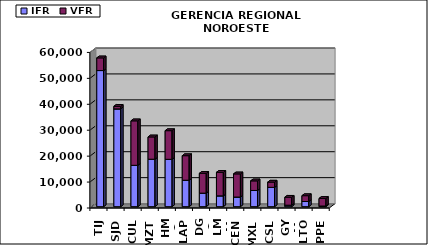
| Category | IFR | VFR |
|---|---|---|
| TIJ | 52501 | 4881 |
| SJD | 37712 | 986 |
| CUL | 15948 | 17155 |
| MZT | 18312 | 8588 |
| HMO | 18265 | 11046 |
| LAP | 10199 | 9465 |
| DGO | 5218 | 7639 |
| LMM | 4171 | 9080 |
| CEN | 3716 | 8922 |
| MXL | 6250 | 3701 |
| CSL | 7446 | 2029 |
| GYM | 577 | 3058 |
| LTO | 1998 | 2243 |
| PPE | 259 | 2916 |